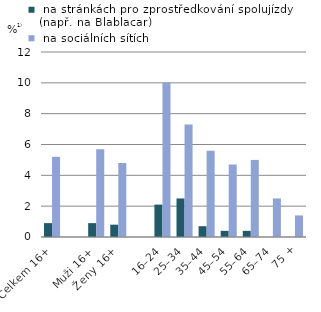
| Category |  na stránkách pro zprostředkování spolujízdy 
(např. na Blablacar) |  na sociálních sítích |
|---|---|---|
| Celkem 16+ | 0.9 | 5.2 |
|  | 0 | 0 |
| Muži 16+ | 0.9 | 5.7 |
| Ženy 16+ | 0.8 | 4.8 |
|  | 0 | 0 |
| 16–24 | 2.1 | 10 |
| 25–34 | 2.5 | 7.3 |
| 35–44 | 0.7 | 5.6 |
| 45–54 | 0.4 | 4.7 |
| 55–64 | 0.4 | 5 |
| 65–74 | 0 | 2.5 |
| 75 + | 0 | 1.4 |